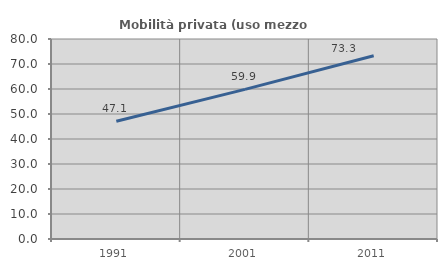
| Category | Mobilità privata (uso mezzo privato) |
|---|---|
| 1991.0 | 47.075 |
| 2001.0 | 59.863 |
| 2011.0 | 73.313 |